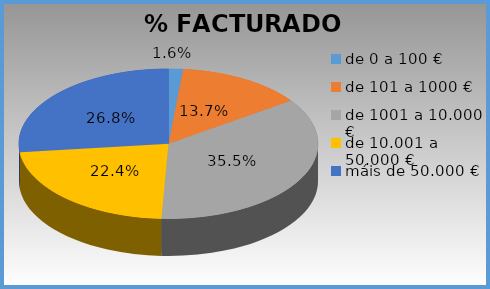
| Category | Series 0 |
|---|---|
| de 0 a 100 € | 0.016 |
| de 101 a 1000 € | 0.137 |
| de 1001 a 10.000 € | 0.355 |
| de 10.001 a 50.000 € | 0.224 |
| máis de 50.000 € | 0.268 |